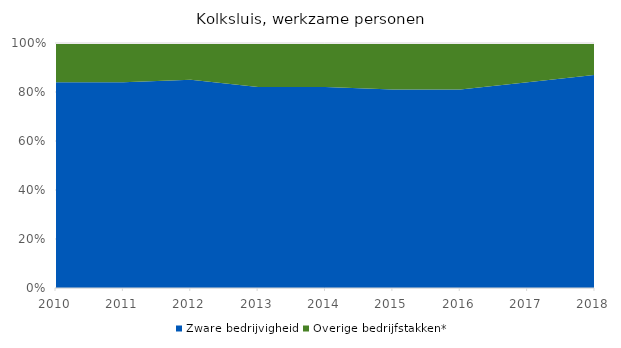
| Category | Zware bedrijvigheid | Overige bedrijfstakken* |
|---|---|---|
| 2010 | 0.84 | 0.16 |
| 2011 | 0.84 | 0.16 |
| 2012 | 0.85 | 0.15 |
| 2013 | 0.82 | 0.18 |
| 2014 | 0.82 | 0.18 |
| 2015 | 0.81 | 0.19 |
| 2016 | 0.81 | 0.19 |
| 2017 | 0.84 | 0.16 |
| 2018 | 0.87 | 0.13 |